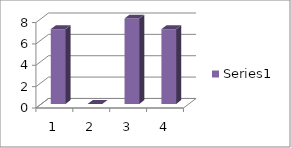
| Category | Series 0 |
|---|---|
| 0 | 7 |
| 1 | 0 |
| 2 | 8 |
| 3 | 7 |